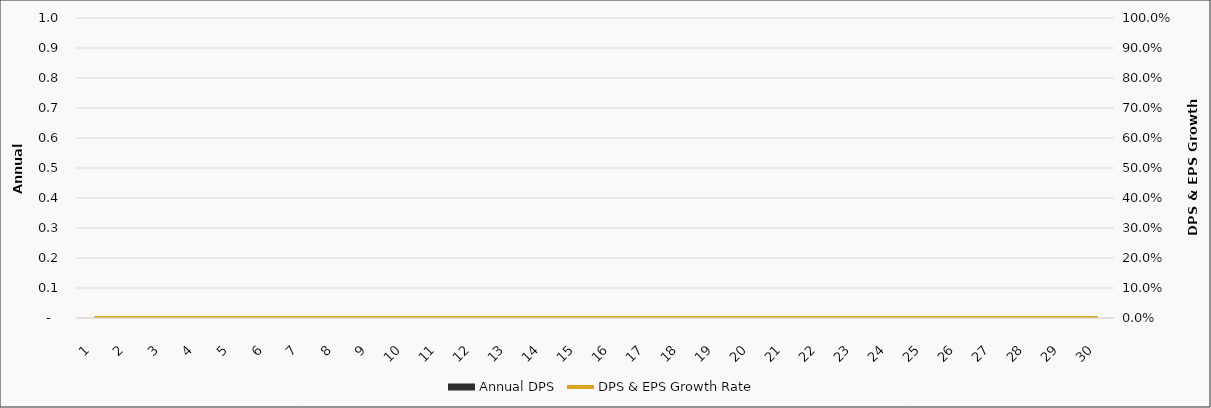
| Category | Annual DPS |
|---|---|
| 1.0 | 0 |
| 2.0 | 0 |
| 3.0 | 0 |
| 4.0 | 0 |
| 5.0 | 0 |
| 6.0 | 0 |
| 7.0 | 0 |
| 8.0 | 0 |
| 9.0 | 0 |
| 10.0 | 0 |
| 11.0 | 0 |
| 12.0 | 0 |
| 13.0 | 0 |
| 14.0 | 0 |
| 15.0 | 0 |
| 16.0 | 0 |
| 17.0 | 0 |
| 18.0 | 0 |
| 19.0 | 0 |
| 20.0 | 0 |
| 21.0 | 0 |
| 22.0 | 0 |
| 23.0 | 0 |
| 24.0 | 0 |
| 25.0 | 0 |
| 26.0 | 0 |
| 27.0 | 0 |
| 28.0 | 0 |
| 29.0 | 0 |
| 30.0 | 0 |